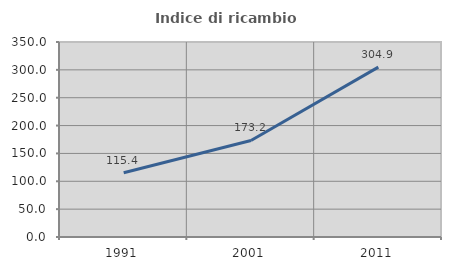
| Category | Indice di ricambio occupazionale  |
|---|---|
| 1991.0 | 115.434 |
| 2001.0 | 173.246 |
| 2011.0 | 304.938 |